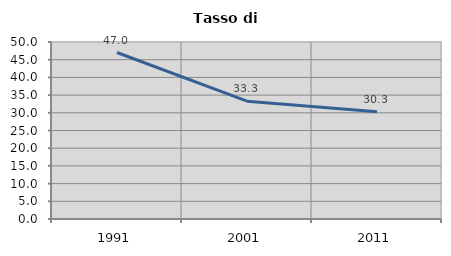
| Category | Tasso di disoccupazione   |
|---|---|
| 1991.0 | 47.029 |
| 2001.0 | 33.283 |
| 2011.0 | 30.271 |